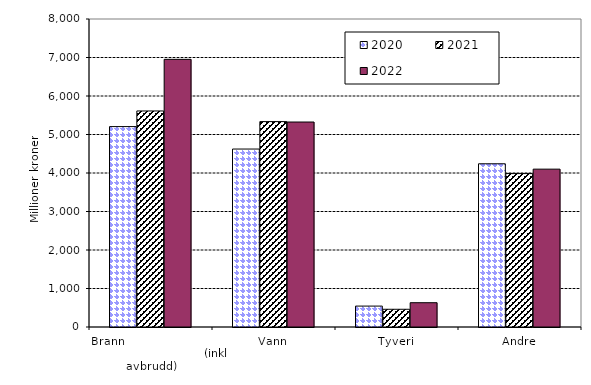
| Category | 2020 | 2021 | 2022 |
|---|---|---|---|
| Brann                                                       (inkl avbrudd) | 5205.622 | 5611.316 | 6952.119 |
| Vann | 4622.244 | 5335.101 | 5324.25 |
| Tyveri | 543.275 | 460.479 | 631.07 |
| Andre | 4239.75 | 3984.789 | 4100.178 |